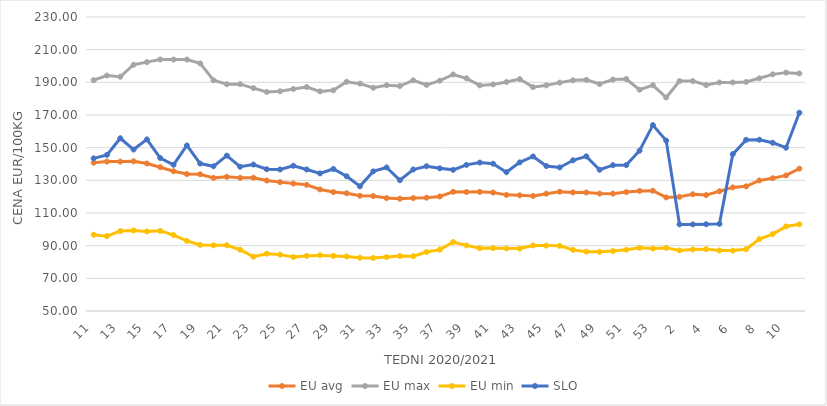
| Category | EU avg | EU max | EU min | SLO |
|---|---|---|---|---|
| 11.0 | 140.789 | 191.32 | 96.705 | 143.45 |
| 12.0 | 141.467 | 194.15 | 95.845 | 145.57 |
| 13.0 | 141.466 | 193.4 | 98.945 | 155.76 |
| 14.0 | 141.645 | 200.79 | 99.347 | 148.84 |
| 15.0 | 140.306 | 202.38 | 98.696 | 155.07 |
| 16.0 | 138.046 | 203.97 | 99.065 | 143.65 |
| 17.0 | 135.556 | 203.97 | 96.499 | 139.55 |
| 18.0 | 133.857 | 203.97 | 92.931 | 151.36 |
| 19.0 | 133.702 | 201.59 | 90.48 | 140.27 |
| 20.0 | 131.51 | 191.27 | 90.199 | 138.59 |
| 21.0 | 132.157 | 188.89 | 90.255 | 145.12 |
| 22.0 | 131.509 | 188.89 | 87.513 | 138.33 |
| 23.0 | 131.578 | 186.47 | 83.199 | 139.64 |
| 24.0 | 129.861 | 184.13 | 85.09 | 136.79 |
| 25.0 | 128.899 | 184.51 | 84.52 | 136.65 |
| 26.0 | 128.034 | 185.91 | 83.06 | 138.92 |
| 27.0 | 127.242 | 187.11 | 83.73 | 136.67 |
| 28.0 | 124.426 | 184.46 | 84.2 | 134.25 |
| 29.0 | 122.822 | 185.09 | 83.72 | 136.94 |
| 30.0 | 122.086 | 190.31 | 83.4 | 132.48 |
| 31.0 | 120.581 | 189.19 | 82.63 | 126.34 |
| 32.0 | 120.341 | 186.67 | 82.46 | 135.48 |
| 33.0 | 119.127 | 188.18 | 82.99 | 137.89 |
| 34.0 | 118.75 | 187.74 | 83.66 | 130.07 |
| 35.0 | 119.136 | 191.25 | 83.53 | 136.63 |
| 36.0 | 119.398 | 188.47 | 86.09 | 138.64 |
| 37.0 | 120.135 | 190.99 | 87.57 | 137.35 |
| 38.0 | 122.982 | 194.8 | 92.21 | 136.42 |
| 39.0 | 122.832 | 192.45 | 90.16 | 139.46 |
| 40.0 | 122.936 | 188.11 | 88.45 | 140.87 |
| 41.0 | 122.507 | 188.73 | 88.54 | 140.18 |
| 42.0 | 121.098 | 190.2 | 88.3 | 134.98 |
| 43.0 | 120.822 | 191.99 | 88.22 | 141 |
| 44.0 | 120.448 | 187.06 | 90.13 | 144.61 |
| 45.0 | 121.843 | 188.15 | 90.04 | 138.73 |
| 46.0 | 123.07 | 189.82 | 89.89 | 137.88 |
| 47.0 | 122.58 | 191.22 | 87.43 | 142.27 |
| 48.0 | 122.553 | 191.52 | 86.35 | 144.69 |
| 49.0 | 121.893 | 188.97 | 86.24 | 136.47 |
| 50.0 | 121.851 | 191.67 | 86.72 | 139.29 |
| 51.0 | 122.8 | 192.06 | 87.5 | 139.35 |
| 52.0 | 123.52 | 185.468 | 88.67 | 148.16 |
| 53.0 | 123.611 | 188.25 | 88.23 | 163.81 |
| 1.0 | 119.553 | 180.72 | 88.64 | 154.31 |
| 2.0 | 119.893 | 190.77 | 87.1 | 103.02 |
| 3.0 | 121.489 | 190.76 | 87.7 | 103.03 |
| 4.0 | 120.954 | 188.33 | 87.88 | 103.15 |
| 5.0 | 123.293 | 189.91 | 87.04 | 103.34 |
| 6.0 | 125.679 | 189.94 | 86.97 | 146.03 |
| 7.0 | 126.326 | 190.21 | 87.79 | 154.77 |
| 8.0 | 129.933 | 192.48 | 94.02 | 154.86 |
| 9.0 | 131.295 | 194.884 | 97.12 | 153 |
| 10.0 | 133.026 | 195.94 | 101.79 | 149.98 |
| 11.0 | 137.152 | 195.419 | 103.05 | 171.4 |